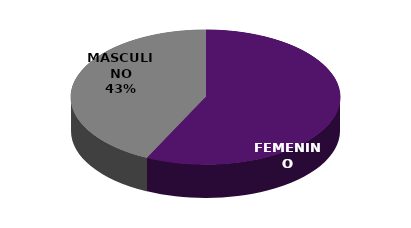
| Category | Series 0 |
|---|---|
| FEMENINO | 4 |
| MASCULINO | 3 |